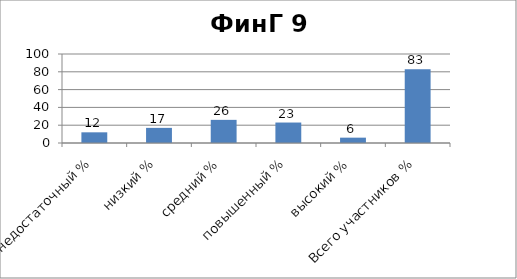
| Category | Series 0 |
|---|---|
| недостаточный % | 12 |
| низкий % | 17 |
| средний % | 26 |
| повышенный % | 23 |
| высокий % | 6 |
| Всего участников % | 83 |